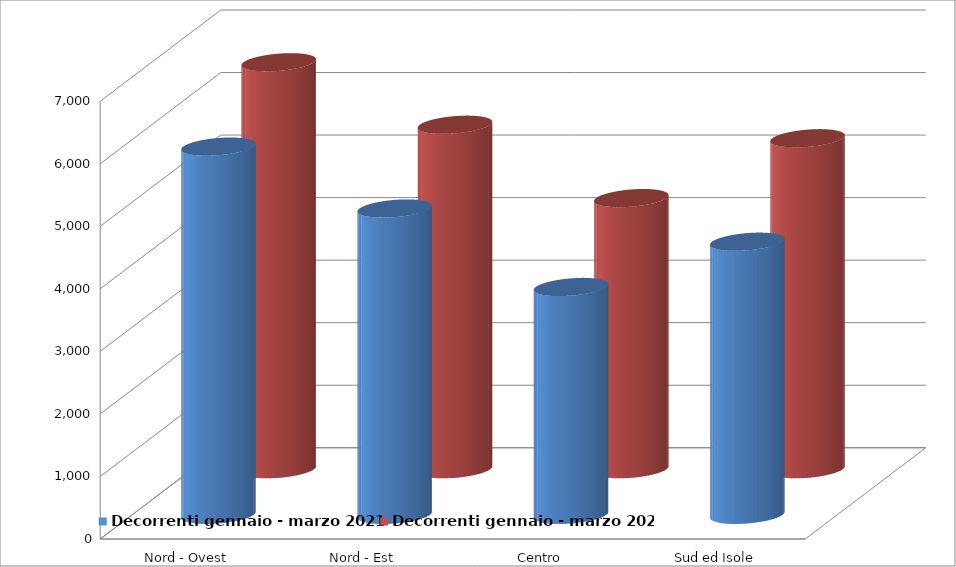
| Category | Decorrenti gennaio - marzo 2021 | Decorrenti gennaio - marzo 2020 |
|---|---|---|
| Nord - Ovest | 5888 | 6507 |
| Nord - Est | 4898 | 5508 |
| Centro | 3643 | 4335 |
| Sud ed Isole | 4367 | 5292 |